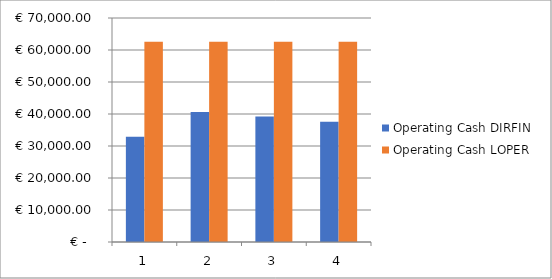
| Category | Operating Cash DIRFIN | Operating Cash LOPER |
|---|---|---|
| 0 | 32860.375 | 62575.3 |
| 1 | 40638.871 | 62575.3 |
| 2 | 39195.217 | 62575.3 |
| 3 | 37607.197 | 62575.3 |